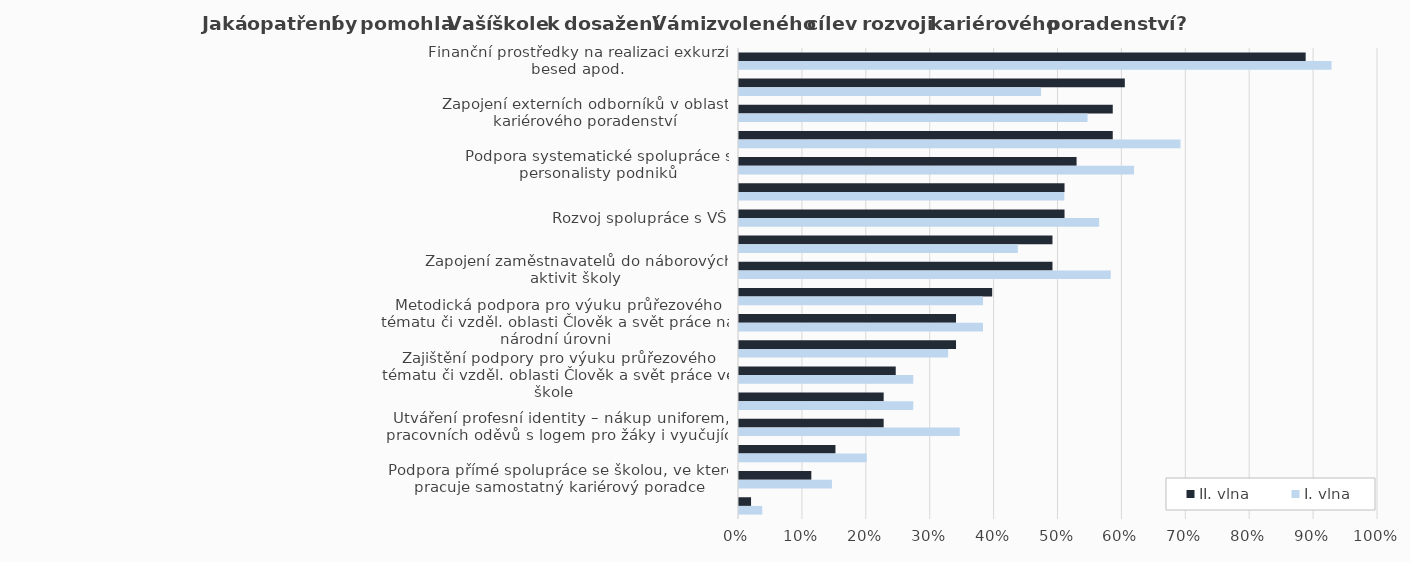
| Category | II. vlna | I. vlna |
|---|---|---|
| Finanční prostředky na realizaci exkurzí, besed apod. | 0.887 | 0.927 |
| Vytvoření odpovídající časové dotace vyučujícím pro poskytování služeb KP | 0.604 | 0.473 |
| Zapojení externích odborníků v oblasti kariérového poradenství | 0.585 | 0.545 |
| Možnost exkurzí do provozů různých zaměstnavatelů pro vyučující SŠ i ZŠ | 0.585 | 0.691 |
| Podpora systematické spolupráce s personalisty podniků | 0.528 | 0.618 |
| Zapojení zaměstnavatelů do výuky i mimo učební aktivity | 0.509 | 0.509 |
| Rozvoj spolupráce s VŠ | 0.509 | 0.564 |
| Možnost pro prohloubené vzdělávání kariérových poradců | 0.491 | 0.436 |
| Zapojení zaměstnavatelů do náborových aktivit školy | 0.491 | 0.582 |
| Vytvoření pozice samostatného kariérového poradce | 0.396 | 0.382 |
| Metodická podpora pro výuku průřezového tématu či vzděl. oblasti Člověk a svět práce na národní úrovni | 0.34 | 0.382 |
| Možnost pro základní vzdělávání kariérových poradců | 0.34 | 0.327 |
| Zajištění podpory pro výuku průřezového tématu či vzděl. oblasti Člověk a svět práce ve škole | 0.245 | 0.273 |
| Příprava komplexního pojetí výuky průřezového tématu či vzděl. oblasti Člověk a svět práce | 0.226 | 0.273 |
| Utváření profesní identity – nákup uniforem, pracovních oděvů s logem pro žáky i vyučující | 0.226 | 0.345 |
| Tvorba vlastních materiálů pro výuku průřezového tématu či vzděl. oblasti Člověk a svět práce | 0.151 | 0.2 |
| Podpora přímé spolupráce se školou, ve které pracuje samostatný kariérový poradce | 0.113 | 0.145 |
| Jiné | 0.019 | 0.036 |